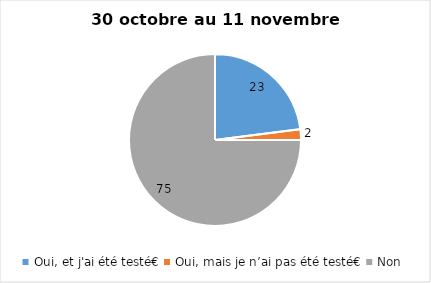
| Category | Series 0 |
|---|---|
| Oui, et j'ai été testé€ | 23 |
| Oui, mais je n’ai pas été testé€ | 2 |
| Non | 75 |